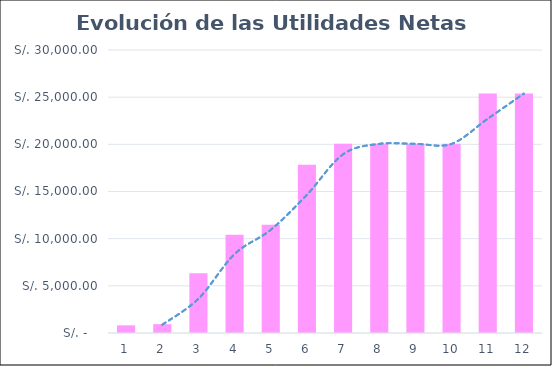
| Category | Series 0 |
|---|---|
| 0 | 812.404 |
| 1 | 935.394 |
| 2 | 6327.774 |
| 3 | 10404.714 |
| 4 | 11469.764 |
| 5 | 17835.144 |
| 6 | 20048.894 |
| 7 | 20048.894 |
| 8 | 20048.894 |
| 9 | 20048.894 |
| 10 | 25381.844 |
| 11 | 25381.844 |